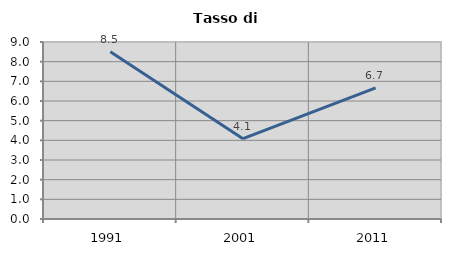
| Category | Tasso di disoccupazione   |
|---|---|
| 1991.0 | 8.499 |
| 2001.0 | 4.085 |
| 2011.0 | 6.67 |